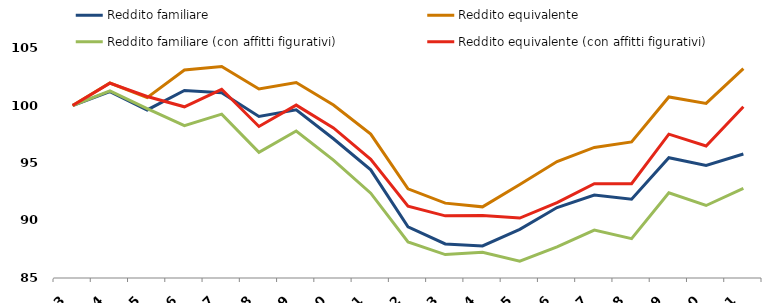
| Category | Reddito familiare | Reddito equivalente | Reddito familiare (con affitti figurativi) | Reddito equivalente (con affitti figurativi) |
|---|---|---|---|---|
| 2003.0 | 100 | 100 | 100 | 100 |
| 2004.0 | 101.21 | 101.955 | 101.266 | 101.948 |
| 2005.0 | 99.613 | 100.683 | 99.737 | 100.78 |
| 2006.0 | 101.309 | 103.087 | 98.244 | 99.886 |
| 2007.0 | 101.105 | 103.394 | 99.245 | 101.408 |
| 2008.0 | 99.044 | 101.431 | 95.932 | 98.174 |
| 2009.0 | 99.628 | 102.002 | 97.782 | 100.034 |
| 2010.0 | 97.108 | 100.039 | 95.25 | 98.046 |
| 2011.0 | 94.407 | 97.512 | 92.373 | 95.322 |
| 2012.0 | 89.446 | 92.75 | 88.138 | 91.245 |
| 2013.0 | 87.964 | 91.51 | 87.036 | 90.404 |
| 2014.0 | 87.784 | 91.186 | 87.238 | 90.44 |
| 2015.0 | 89.232 | 93.125 | 86.469 | 90.21 |
| 2016.0 | 91.129 | 95.13 | 87.704 | 91.549 |
| 2017.0 | 92.214 | 96.357 | 89.167 | 93.196 |
| 2018.0 | 91.854 | 96.831 | 88.422 | 93.198 |
| 2019.0 | 95.456 | 100.741 | 92.414 | 97.509 |
| 2020.0 | 94.793 | 100.181 | 91.304 | 96.477 |
| 2021.0 | 95.783 | 103.2 | 92.785 | 99.885 |